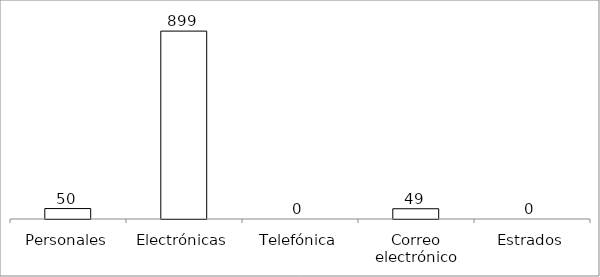
| Category | Series 0 |
|---|---|
| Personales | 50 |
| Electrónicas | 899 |
| Telefónica | 0 |
| Correo electrónico | 49 |
| Estrados | 0 |